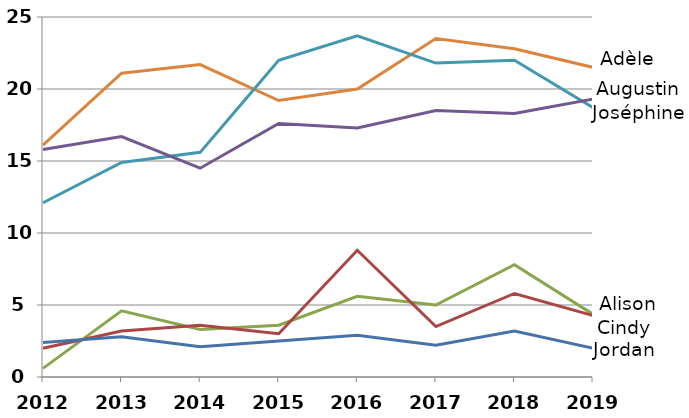
| Category | Adèle | Joséphine | Augustin | Alison | Cindy | Jordan |
|---|---|---|---|---|---|---|
| 2012.0 | 16.1 | 12.1 | 15.8 | 0.6 | 2 | 2.4 |
| 2013.0 | 21.1 | 14.9 | 16.7 | 4.6 | 3.2 | 2.8 |
| 2014.0 | 21.7 | 15.6 | 14.5 | 3.3 | 3.6 | 2.1 |
| 2015.0 | 19.2 | 22 | 17.6 | 3.6 | 3 | 2.5 |
| 2016.0 | 20 | 23.7 | 17.3 | 5.6 | 8.8 | 2.9 |
| 2017.0 | 23.5 | 21.8 | 18.5 | 5 | 3.5 | 2.2 |
| 2018.0 | 22.8 | 22 | 18.3 | 7.8 | 5.8 | 3.2 |
| 2019.0 | 21.5 | 18.7 | 19.3 | 4.357 | 4.271 | 2 |